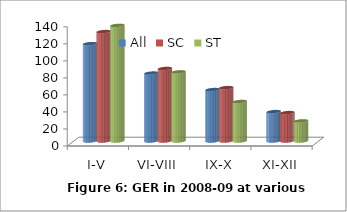
| Category | All | SC | ST |
|---|---|---|---|
| I-V | 114.342 | 128.479 | 135.768 |
| VI-VIII | 79.762 | 85.157 | 81.187 |
| IX-X | 60.371 | 62.683 | 46.373 |
| XI-XII | 34.511 | 33.33 | 23.618 |